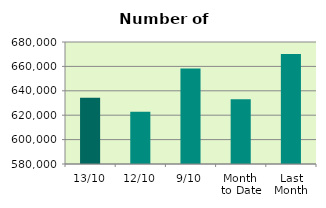
| Category | Series 0 |
|---|---|
| 13/10 | 634298 |
| 12/10 | 622900 |
| 9/10 | 658288 |
| Month 
to Date | 632972.222 |
| Last
Month | 670189.636 |